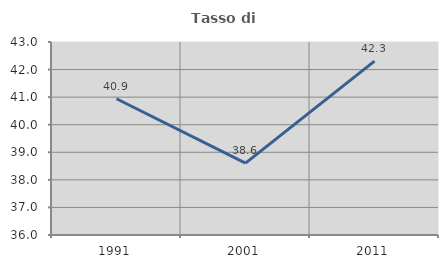
| Category | Tasso di occupazione   |
|---|---|
| 1991.0 | 40.942 |
| 2001.0 | 38.606 |
| 2011.0 | 42.308 |